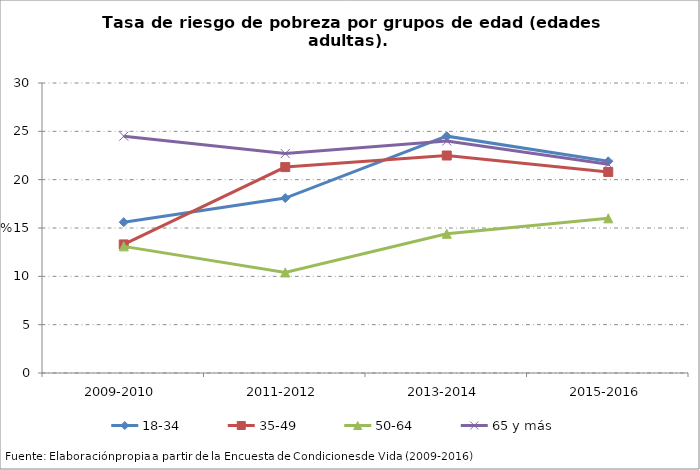
| Category | 18-34 | 35-49 | 50-64 | 65 y más |
|---|---|---|---|---|
| 2009-2010 | 15.6 | 13.3 | 13.1 | 24.5 |
| 2011-2012 | 18.1 | 21.3 | 10.4 | 22.7 |
| 2013-2014 | 24.5 | 22.5 | 14.4 | 24 |
| 2015-2016 | 21.9 | 20.8 | 16 | 21.6 |